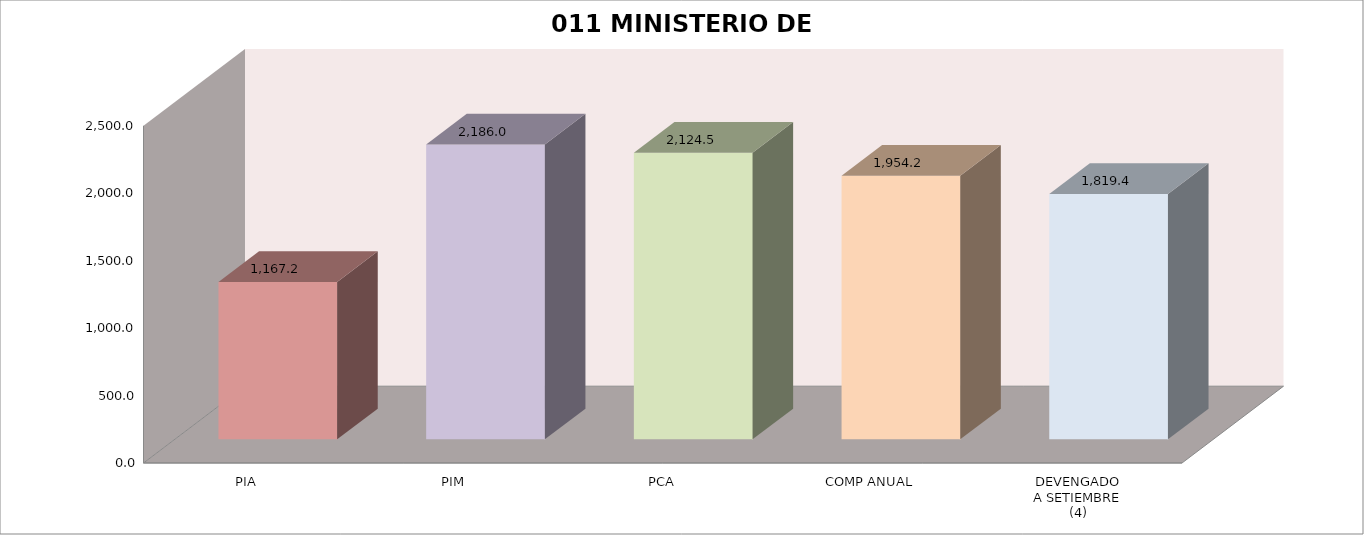
| Category | 011 MINISTERIO DE SALUD |
|---|---|
| PIA | 1167.209 |
| PIM | 2186.029 |
| PCA | 2124.521 |
| COMP ANUAL | 1954.215 |
| DEVENGADO
A SETIEMBRE
(4) | 1819.429 |